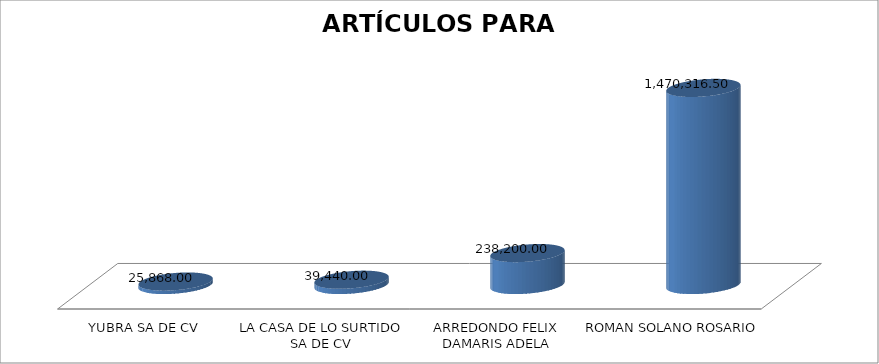
| Category | SUMA |
|---|---|
| YUBRA SA DE CV | 25868 |
| LA CASA DE LO SURTIDO SA DE CV | 39440 |
| ARREDONDO FELIX DAMARIS ADELA | 238200 |
| ROMAN SOLANO ROSARIO | 1470316.5 |